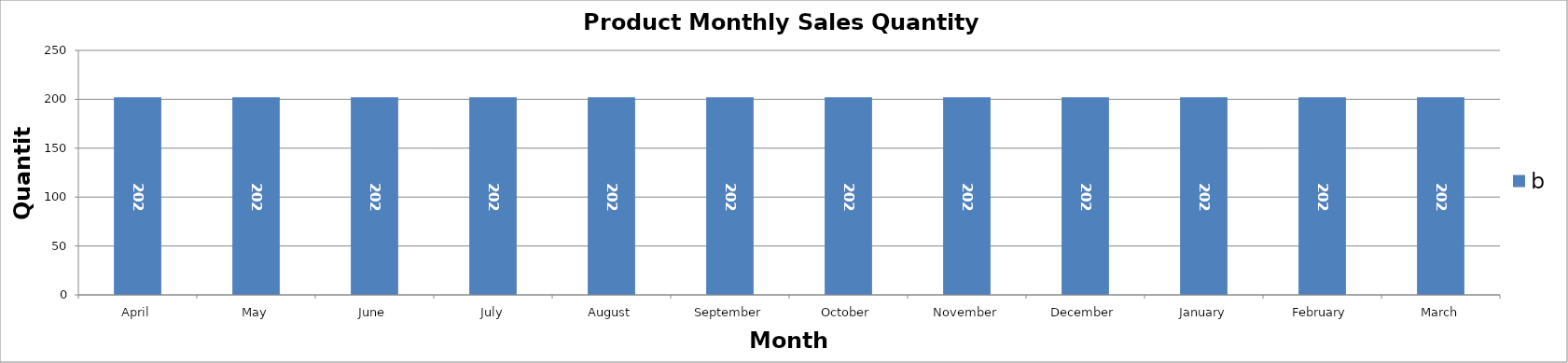
| Category | b |
|---|---|
| April | 202 |
| May | 202 |
| June | 202 |
| July | 202 |
| August | 202 |
| September | 202 |
| October | 202 |
| November | 202 |
| December | 202 |
| January | 202 |
| February | 202 |
| March | 202 |